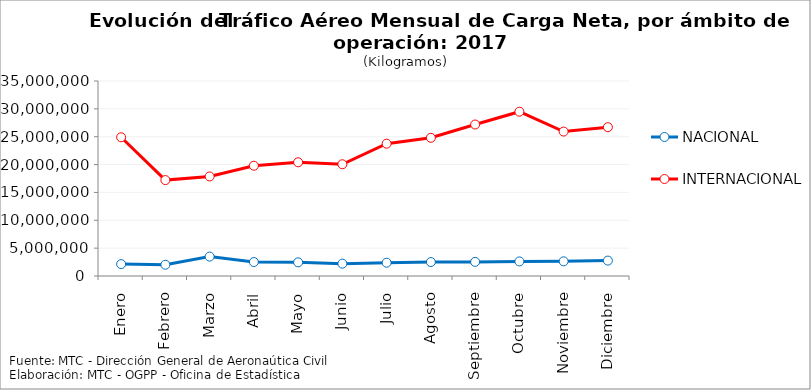
| Category | NACIONAL | INTERNACIONAL |
|---|---|---|
| Enero | 2133100.18 | 24900269 |
| Febrero | 2020687.16 | 17216819 |
| Marzo | 3482190.51 | 17868504 |
| Abril | 2509303.64 | 19796478 |
| Mayo | 2453842.95 | 20411939 |
| Junio | 2214738.36 | 20056774 |
| Julio | 2386257.03 | 23751040 |
| Agosto | 2503686.05 | 24807374 |
| Septiembre | 2533990.39 | 27188629 |
| Octubre | 2619137.93 | 29489176 |
| Noviembre | 2633011.81 | 25924933 |
| Diciembre | 2766030.79 | 26711595 |